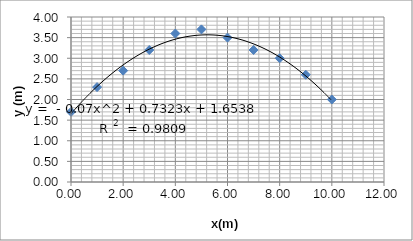
| Category | y(m) |
|---|---|
| 0.0 | 1.7 |
| 1.0 | 2.3 |
| 2.0 | 2.7 |
| 3.0 | 3.2 |
| 4.0 | 3.6 |
| 5.0 | 3.7 |
| 6.0 | 3.5 |
| 7.0 | 3.2 |
| 8.0 | 3 |
| 9.0 | 2.6 |
| 10.0 | 2 |